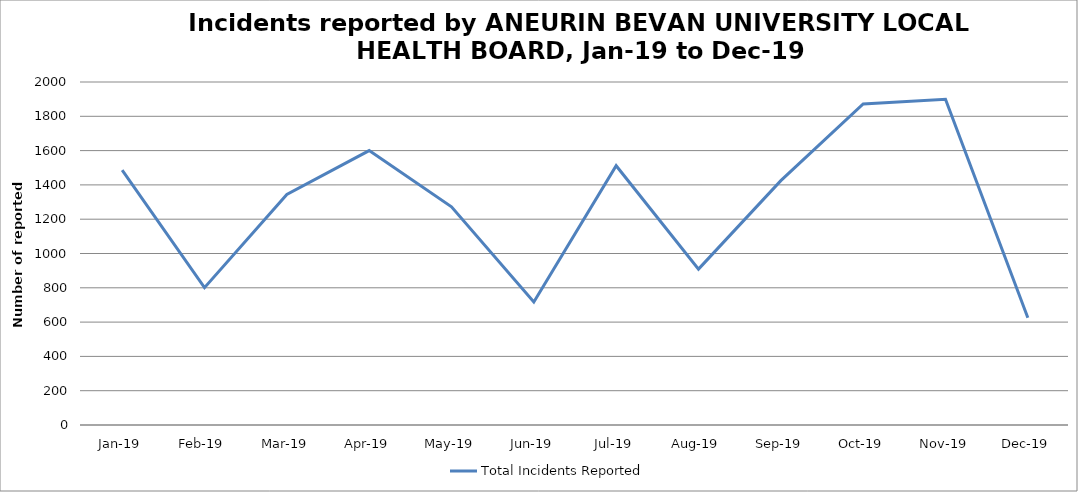
| Category | Total Incidents Reported |
|---|---|
| Jan-19 | 1486 |
| Feb-19 | 801 |
| Mar-19 | 1344 |
| Apr-19 | 1600 |
| May-19 | 1272 |
| Jun-19 | 717 |
| Jul-19 | 1512 |
| Aug-19 | 909 |
| Sep-19 | 1425 |
| Oct-19 | 1872 |
| Nov-19 | 1899 |
| Dec-19 | 625 |